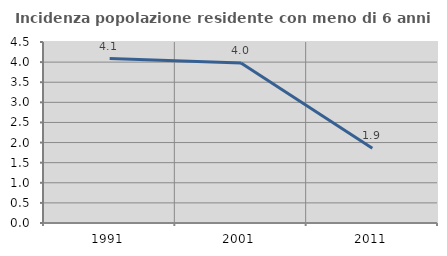
| Category | Incidenza popolazione residente con meno di 6 anni |
|---|---|
| 1991.0 | 4.088 |
| 2001.0 | 3.977 |
| 2011.0 | 1.858 |